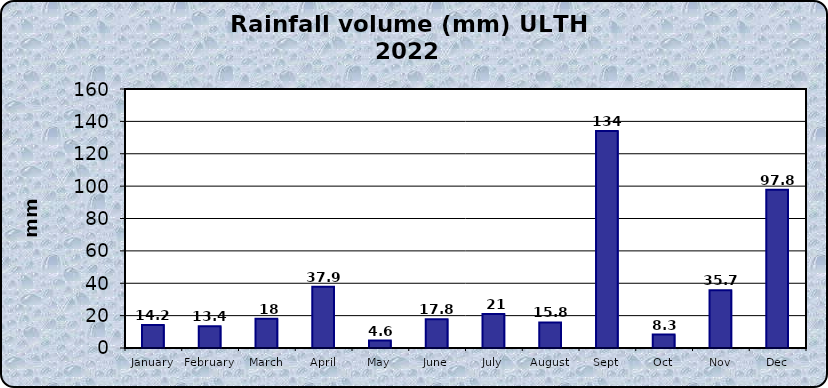
| Category | Series 0 |
|---|---|
| January | 14.2 |
| February | 13.4 |
| March | 18 |
| April | 37.9 |
| May | 4.6 |
| June | 17.8 |
| July | 21 |
| August | 15.8 |
| Sept | 134 |
| Oct | 8.3 |
| Nov | 35.7 |
| Dec | 97.8 |